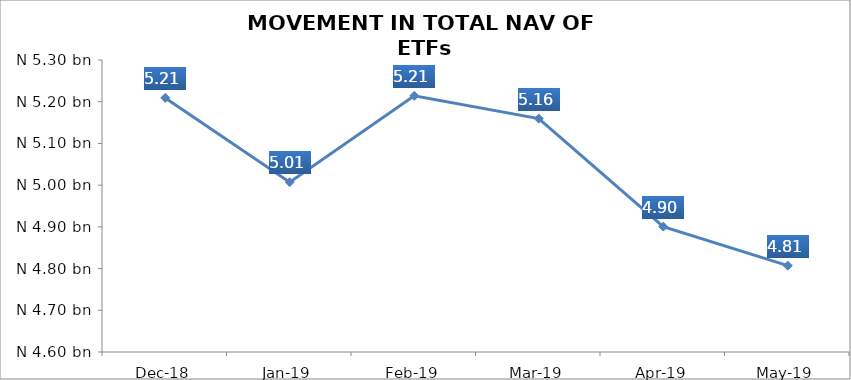
| Category | Series 0 |
|---|---|
| 2018-12-01 | 5209127720.29 |
| 2019-01-01 | 5007243642.12 |
| 2019-02-01 | 5214161600.39 |
| 2019-03-01 | 5159546061.43 |
| 2019-04-01 | 4900686319.26 |
| 2019-05-01 | 4806926836.41 |